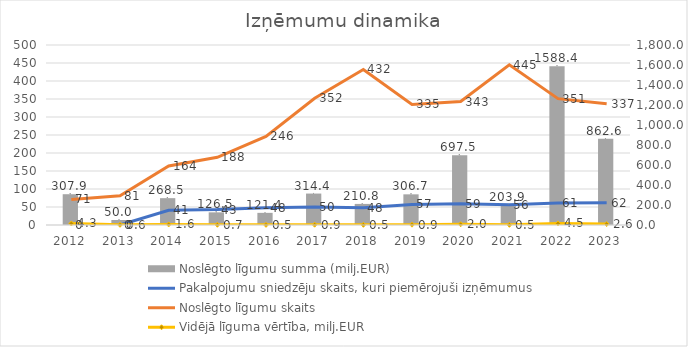
| Category | Noslēgto līgumu summa (milj.EUR) |
|---|---|
| 2012.0 | 307.912 |
| 2013.0 | 50.012 |
| 2014.0 | 268.503 |
| 2015.0 | 126.516 |
| 2016.0 | 121.4 |
| 2017.0 | 314.424 |
| 2018.0 | 210.8 |
| 2019.0 | 306.7 |
| 2020.0 | 697.5 |
| 2021.0 | 203.9 |
| 2022.0 | 1588.4 |
| 2023.0 | 862.6 |